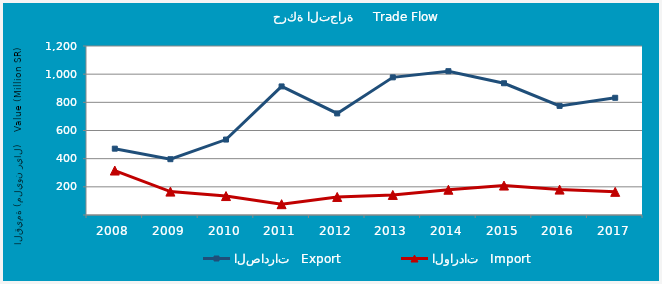
| Category | الصادرات   Export | الواردات   Import |
|---|---|---|
| 2008.0 | 471039674 | 315657718 |
| 2009.0 | 396212151 | 166036608 |
| 2010.0 | 535695449 | 134496483 |
| 2011.0 | 912948487 | 76872214 |
| 2012.0 | 721238086 | 128091843 |
| 2013.0 | 977430366 | 142451281 |
| 2014.0 | 1021172161 | 179458705 |
| 2015.0 | 935492823 | 208951504 |
| 2016.0 | 774687359 | 180337363 |
| 2017.0 | 832233720 | 164377328 |